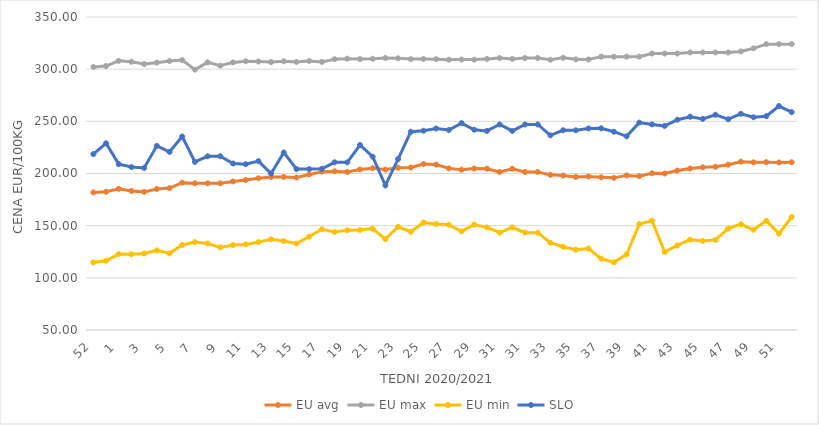
| Category | EU avg | EU max | EU min | SLO |
|---|---|---|---|---|
| 52.0 | 181.9 | 302.14 | 114.76 | 218.61 |
| 53.0 | 182.536 | 303 | 116.375 | 229 |
| 1.0 | 185.3 | 308 | 122.769 | 209 |
| 2.0 | 183.25 | 307.1 | 122.609 | 206.15 |
| 3.0 | 182.393 | 304.91 | 123.32 | 205.35 |
| 4.0 | 185.158 | 306.22 | 126.329 | 226.48 |
| 5.0 | 186.04 | 307.79 | 123.461 | 220.65 |
| 6.0 | 191.206 | 308.7 | 131.528 | 235.46 |
| 7.0 | 190.629 | 299.55 | 134.262 | 211.1 |
| 8.0 | 190.57 | 306.55 | 132.97 | 216.51 |
| 9.0 | 190.562 | 303.4 | 129.173 | 216.54 |
| 10.0 | 192.373 | 306.48 | 131.374 | 209.61 |
| 11.0 | 193.79 | 307.58 | 132.024 | 208.91 |
| 12.0 | 195.449 | 307.33 | 134.212 | 211.87 |
| 13.0 | 196.631 | 306.85 | 136.936 | 199.93 |
| 14.0 | 196.702 | 307.56 | 135.297 | 220.15 |
| 15.0 | 196.13 | 306.96 | 132.893 | 204.2 |
| 16.0 | 199.1 | 307.87 | 139.462 | 204.2 |
| 17.0 | 201.754 | 306.98 | 146.538 | 204.51 |
| 18.0 | 202.13 | 309.49 | 144.017 | 210.72 |
| 19.0 | 201.439 | 310.06 | 145.644 | 210.68 |
| 20.0 | 203.834 | 309.69 | 145.911 | 227.32 |
| 21.0 | 205.04 | 309.99 | 147.188 | 216.08 |
| 22.0 | 203.79 | 310.76 | 137.177 | 188.6 |
| 23.0 | 205.51 | 310.41 | 148.928 | 213.84 |
| 24.0 | 205.73 | 309.64 | 144.161 | 239.99 |
| 25.0 | 209.095 | 309.74 | 153.081 | 240.99 |
| 26.0 | 208.551 | 309.55 | 151.599 | 243.11 |
| 27.0 | 204.914 | 309.08 | 150.789 | 241.72 |
| 28.0 | 203.681 | 309.21 | 144.56 | 248.33 |
| 29.0 | 204.773 | 309.15 | 151.052 | 241.96 |
| 30.0 | 204.558 | 309.78 | 148.33 | 240.79 |
| 31.0 | 201.483 | 310.67 | 143.33 | 247 |
| 30.0 | 204.558 | 309.78 | 148.33 | 240.79 |
| 31.0 | 201.483 | 310.67 | 143.33 | 247 |
| 32.0 | 201.483 | 310.67 | 143.33 | 247 |
| 33.0 | 198.691 | 309 | 133.607 | 236.54 |
| 34.0 | 198.027 | 310.9 | 129.797 | 241.45 |
| 35.0 | 196.72 | 309.41 | 126.926 | 241.39 |
| 36.0 | 197.157 | 309.28 | 128.099 | 243.19 |
| 37.0 | 196.375 | 312 | 118.364 | 243.28 |
| 38.0 | 195.821 | 312 | 114.892 | 240.06 |
| 39.0 | 198.179 | 312 | 122.517 | 235.66 |
| 40.0 | 197.482 | 312 | 151.488 | 248.77 |
| 41.0 | 200.22 | 315 | 154.74 | 247.07 |
| 42.0 | 199.965 | 315 | 124.748 | 245.64 |
| 43.0 | 202.804 | 315 | 131.104 | 251.53 |
| 44.0 | 204.713 | 316 | 136.6 | 254.42 |
| 45.0 | 205.906 | 316 | 135.362 | 252.35 |
| 46.0 | 206.476 | 316 | 136.39 | 256.33 |
| 47.0 | 208.415 | 316 | 147.192 | 252.01 |
| 48.0 | 211.314 | 317 | 151.41 | 257.25 |
| 49.0 | 210.677 | 320 | 146.064 | 253.87 |
| 50.0 | 210.823 | 324 | 154.698 | 254.94 |
| 51.0 | 210.59 | 324 | 142.382 | 264.65 |
| 52.0 | 210.763 | 324 | 158.333 | 258.8 |